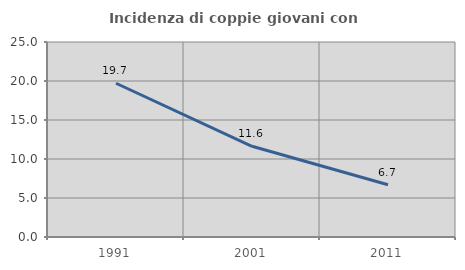
| Category | Incidenza di coppie giovani con figli |
|---|---|
| 1991.0 | 19.711 |
| 2001.0 | 11.628 |
| 2011.0 | 6.703 |